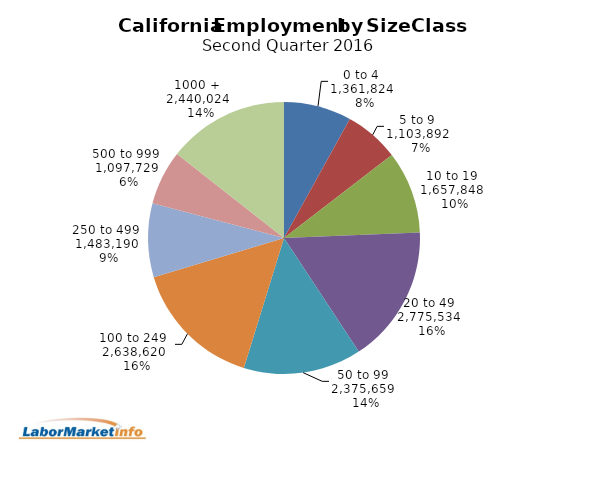
| Category | Series 1 |
|---|---|
| 0 to 4   | 1361824 |
| 5 to 9   | 1103892 |
| 10 to 19   | 1657848 |
| 20 to 49   | 2775534 |
| 50 to 99   | 2375659 |
| 100 to 249   | 2638620 |
| 250 to 499   | 1483190 |
| 500 to 999   | 1097729 |
| 1000 +   | 2440024 |